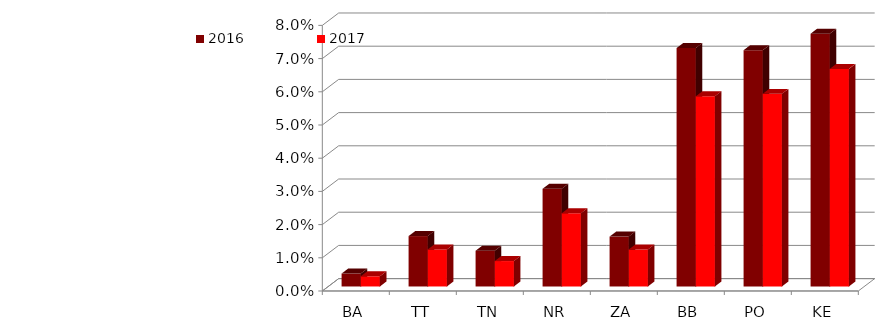
| Category | 2016 | 2017 |
|---|---|---|
| BA | 0.004 | 0.003 |
| TT | 0.015 | 0.011 |
| TN | 0.011 | 0.008 |
| NR | 0.029 | 0.022 |
| ZA | 0.015 | 0.011 |
| BB | 0.072 | 0.057 |
| PO | 0.071 | 0.058 |
| KE | 0.076 | 0.066 |